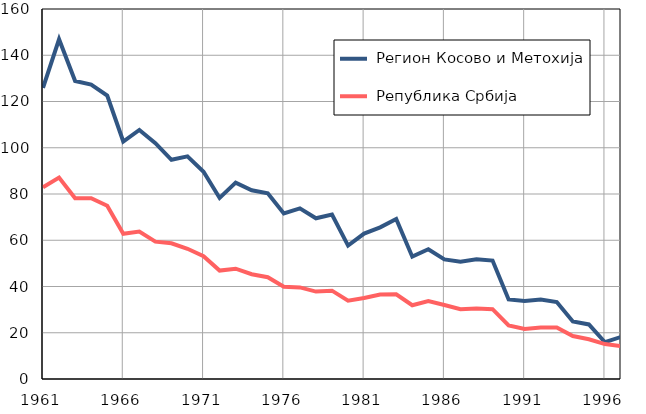
| Category |  Регион Косово и Метохија |  Република Србија |
|---|---|---|
| 1961.0 | 125.9 | 82.9 |
| 1962.0 | 146.9 | 87.1 |
| 1963.0 | 128.9 | 78.2 |
| 1964.0 | 127.3 | 78.2 |
| 1965.0 | 122.6 | 74.9 |
| 1966.0 | 102.7 | 62.8 |
| 1967.0 | 107.7 | 63.8 |
| 1968.0 | 102 | 59.4 |
| 1969.0 | 94.8 | 58.7 |
| 1970.0 | 96.3 | 56.3 |
| 1971.0 | 89.6 | 53.1 |
| 1972.0 | 78.3 | 46.9 |
| 1973.0 | 84.9 | 47.7 |
| 1974.0 | 81.6 | 45.3 |
| 1975.0 | 80.3 | 44 |
| 1976.0 | 71.6 | 39.9 |
| 1977.0 | 73.8 | 39.6 |
| 1978.0 | 69.5 | 37.8 |
| 1979.0 | 71.1 | 38.2 |
| 1980.0 | 57.7 | 33.9 |
| 1981.0 | 62.9 | 35 |
| 1982.0 | 65.6 | 36.5 |
| 1983.0 | 69.2 | 36.6 |
| 1984.0 | 52.9 | 31.9 |
| 1985.0 | 56.1 | 33.7 |
| 1986.0 | 51.7 | 32 |
| 1987.0 | 50.7 | 30.2 |
| 1988.0 | 51.8 | 30.5 |
| 1989.0 | 51.2 | 30.2 |
| 1990.0 | 34.4 | 23.2 |
| 1991.0 | 33.7 | 21.6 |
| 1992.0 | 34.4 | 22.3 |
| 1993.0 | 33.3 | 22.3 |
| 1994.0 | 24.9 | 18.6 |
| 1995.0 | 23.6 | 17.2 |
| 1996.0 | 15.9 | 15.1 |
| 1997.0 | 18.2 | 14.2 |